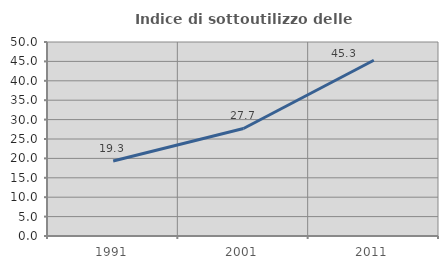
| Category | Indice di sottoutilizzo delle abitazioni  |
|---|---|
| 1991.0 | 19.338 |
| 2001.0 | 27.711 |
| 2011.0 | 45.293 |